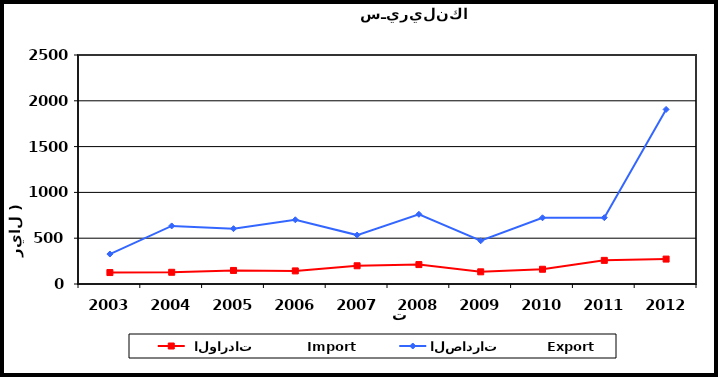
| Category |  الواردات           Import | الصادرات          Export |
|---|---|---|
| 2003.0 | 125 | 327 |
| 2004.0 | 128 | 634 |
| 2005.0 | 148 | 604 |
| 2006.0 | 143 | 701 |
| 2007.0 | 199 | 534 |
| 2008.0 | 212 | 761 |
| 2009.0 | 133 | 472 |
| 2010.0 | 161 | 723 |
| 2011.0 | 258 | 724 |
| 2012.0 | 272 | 1906 |